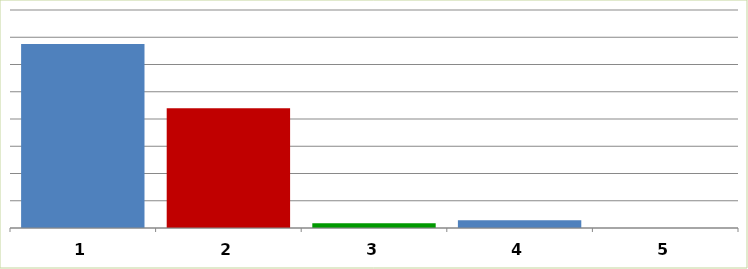
| Category | Series 0 |
|---|---|
| 0 | 33777414 |
| 1 | 21975964 |
| 2 | 851430 |
| 3 | 1442154 |
| 4 | 0 |